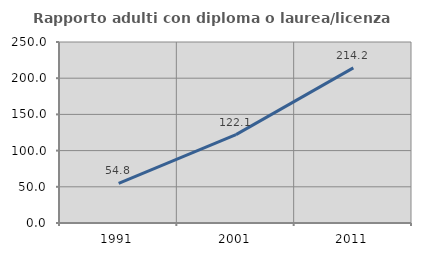
| Category | Rapporto adulti con diploma o laurea/licenza media  |
|---|---|
| 1991.0 | 54.783 |
| 2001.0 | 122.078 |
| 2011.0 | 214.214 |